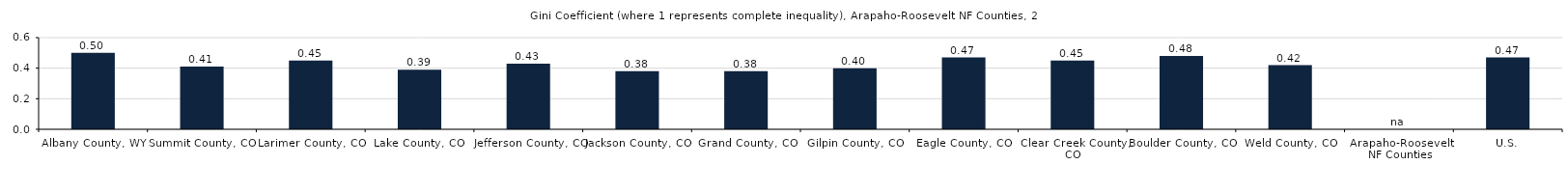
| Category | Gini Coefficient^ |
|---|---|
| Gallatin County, MT | 0.44 |
| County Region | 0.44 |
| U.S. | 0.467 |